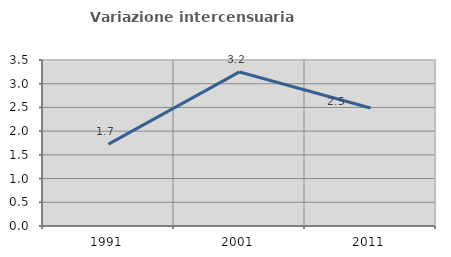
| Category | Variazione intercensuaria annua |
|---|---|
| 1991.0 | 1.726 |
| 2001.0 | 3.248 |
| 2011.0 | 2.488 |